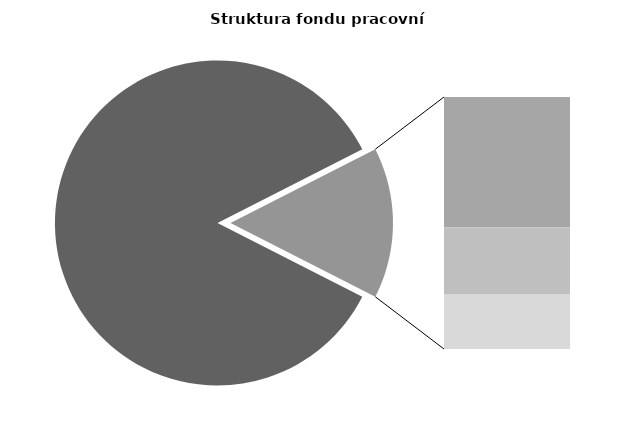
| Category | Series 0 |
|---|---|
| Průměrná měsíční odpracovaná doba bez přesčasu | 144.609 |
| Dovolená | 13.228 |
| Nemoc | 6.723 |
| Jiné | 5.571 |